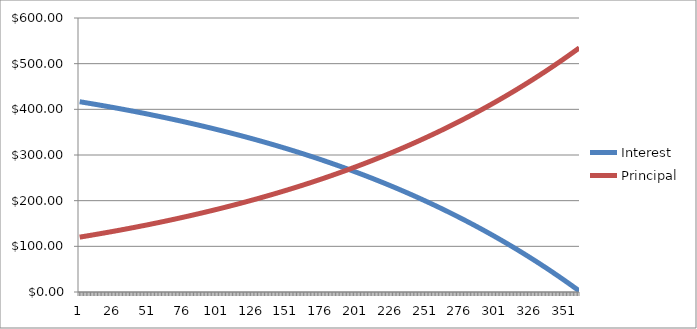
| Category | Interest | Principal |
|---|---|---|
| 0 | 416.667 | 120.155 |
| 1 | 416.166 | 120.656 |
| 2 | 415.663 | 121.158 |
| 3 | 415.158 | 121.663 |
| 4 | 414.652 | 122.17 |
| 5 | 414.142 | 122.679 |
| 6 | 413.631 | 123.19 |
| 7 | 413.118 | 123.704 |
| 8 | 412.603 | 124.219 |
| 9 | 412.085 | 124.737 |
| 10 | 411.565 | 125.256 |
| 11 | 411.043 | 125.778 |
| 12 | 410.519 | 126.302 |
| 13 | 409.993 | 126.829 |
| 14 | 409.465 | 127.357 |
| 15 | 408.934 | 127.888 |
| 16 | 408.401 | 128.421 |
| 17 | 407.866 | 128.956 |
| 18 | 407.329 | 129.493 |
| 19 | 406.789 | 130.032 |
| 20 | 406.247 | 130.574 |
| 21 | 405.703 | 131.118 |
| 22 | 405.157 | 131.665 |
| 23 | 404.608 | 132.213 |
| 24 | 404.057 | 132.764 |
| 25 | 403.504 | 133.317 |
| 26 | 402.949 | 133.873 |
| 27 | 402.391 | 134.431 |
| 28 | 401.831 | 134.991 |
| 29 | 401.268 | 135.553 |
| 30 | 400.704 | 136.118 |
| 31 | 400.136 | 136.685 |
| 32 | 399.567 | 137.255 |
| 33 | 398.995 | 137.827 |
| 34 | 398.421 | 138.401 |
| 35 | 397.844 | 138.978 |
| 36 | 397.265 | 139.557 |
| 37 | 396.683 | 140.138 |
| 38 | 396.1 | 140.722 |
| 39 | 395.513 | 141.308 |
| 40 | 394.924 | 141.897 |
| 41 | 394.333 | 142.488 |
| 42 | 393.74 | 143.082 |
| 43 | 393.143 | 143.678 |
| 44 | 392.545 | 144.277 |
| 45 | 391.944 | 144.878 |
| 46 | 391.34 | 145.482 |
| 47 | 390.734 | 146.088 |
| 48 | 390.125 | 146.697 |
| 49 | 389.514 | 147.308 |
| 50 | 388.9 | 147.922 |
| 51 | 388.284 | 148.538 |
| 52 | 387.665 | 149.157 |
| 53 | 387.043 | 149.778 |
| 54 | 386.419 | 150.402 |
| 55 | 385.792 | 151.029 |
| 56 | 385.163 | 151.658 |
| 57 | 384.531 | 152.29 |
| 58 | 383.897 | 152.925 |
| 59 | 383.26 | 153.562 |
| 60 | 382.62 | 154.202 |
| 61 | 381.977 | 154.844 |
| 62 | 381.332 | 155.49 |
| 63 | 380.684 | 156.137 |
| 64 | 380.034 | 156.788 |
| 65 | 379.38 | 157.441 |
| 66 | 378.724 | 158.097 |
| 67 | 378.066 | 158.756 |
| 68 | 377.404 | 159.418 |
| 69 | 376.74 | 160.082 |
| 70 | 376.073 | 160.749 |
| 71 | 375.403 | 161.419 |
| 72 | 374.73 | 162.091 |
| 73 | 374.055 | 162.767 |
| 74 | 373.377 | 163.445 |
| 75 | 372.696 | 164.126 |
| 76 | 372.012 | 164.81 |
| 77 | 371.325 | 165.496 |
| 78 | 370.636 | 166.186 |
| 79 | 369.943 | 166.878 |
| 80 | 369.248 | 167.574 |
| 81 | 368.55 | 168.272 |
| 82 | 367.849 | 168.973 |
| 83 | 367.145 | 169.677 |
| 84 | 366.438 | 170.384 |
| 85 | 365.728 | 171.094 |
| 86 | 365.015 | 171.807 |
| 87 | 364.299 | 172.523 |
| 88 | 363.58 | 173.242 |
| 89 | 362.858 | 173.963 |
| 90 | 362.133 | 174.688 |
| 91 | 361.405 | 175.416 |
| 92 | 360.675 | 176.147 |
| 93 | 359.941 | 176.881 |
| 94 | 359.204 | 177.618 |
| 95 | 358.464 | 178.358 |
| 96 | 357.72 | 179.101 |
| 97 | 356.974 | 179.847 |
| 98 | 356.225 | 180.597 |
| 99 | 355.472 | 181.349 |
| 100 | 354.717 | 182.105 |
| 101 | 353.958 | 182.864 |
| 102 | 353.196 | 183.626 |
| 103 | 352.431 | 184.391 |
| 104 | 351.663 | 185.159 |
| 105 | 350.891 | 185.931 |
| 106 | 350.116 | 186.705 |
| 107 | 349.338 | 187.483 |
| 108 | 348.557 | 188.264 |
| 109 | 347.773 | 189.049 |
| 110 | 346.985 | 189.837 |
| 111 | 346.194 | 190.628 |
| 112 | 345.4 | 191.422 |
| 113 | 344.602 | 192.219 |
| 114 | 343.801 | 193.02 |
| 115 | 342.997 | 193.825 |
| 116 | 342.189 | 194.632 |
| 117 | 341.379 | 195.443 |
| 118 | 340.564 | 196.257 |
| 119 | 339.746 | 197.075 |
| 120 | 338.925 | 197.896 |
| 121 | 338.101 | 198.721 |
| 122 | 337.273 | 199.549 |
| 123 | 336.441 | 200.38 |
| 124 | 335.606 | 201.215 |
| 125 | 334.768 | 202.054 |
| 126 | 333.926 | 202.896 |
| 127 | 333.081 | 203.741 |
| 128 | 332.232 | 204.59 |
| 129 | 331.379 | 205.442 |
| 130 | 330.523 | 206.298 |
| 131 | 329.664 | 207.158 |
| 132 | 328.801 | 208.021 |
| 133 | 327.934 | 208.888 |
| 134 | 327.063 | 209.758 |
| 135 | 326.189 | 210.632 |
| 136 | 325.312 | 211.51 |
| 137 | 324.43 | 212.391 |
| 138 | 323.546 | 213.276 |
| 139 | 322.657 | 214.165 |
| 140 | 321.765 | 215.057 |
| 141 | 320.868 | 215.953 |
| 142 | 319.969 | 216.853 |
| 143 | 319.065 | 217.757 |
| 144 | 318.158 | 218.664 |
| 145 | 317.247 | 219.575 |
| 146 | 316.332 | 220.49 |
| 147 | 315.413 | 221.409 |
| 148 | 314.491 | 222.331 |
| 149 | 313.564 | 223.257 |
| 150 | 312.634 | 224.188 |
| 151 | 311.7 | 225.122 |
| 152 | 310.762 | 226.06 |
| 153 | 309.82 | 227.002 |
| 154 | 308.874 | 227.948 |
| 155 | 307.924 | 228.897 |
| 156 | 306.971 | 229.851 |
| 157 | 306.013 | 230.809 |
| 158 | 305.051 | 231.771 |
| 159 | 304.085 | 232.736 |
| 160 | 303.116 | 233.706 |
| 161 | 302.142 | 234.68 |
| 162 | 301.164 | 235.658 |
| 163 | 300.182 | 236.639 |
| 164 | 299.196 | 237.625 |
| 165 | 298.206 | 238.616 |
| 166 | 297.212 | 239.61 |
| 167 | 296.213 | 240.608 |
| 168 | 295.211 | 241.611 |
| 169 | 294.204 | 242.617 |
| 170 | 293.193 | 243.628 |
| 171 | 292.178 | 244.643 |
| 172 | 291.159 | 245.663 |
| 173 | 290.135 | 246.686 |
| 174 | 289.107 | 247.714 |
| 175 | 288.075 | 248.746 |
| 176 | 287.039 | 249.783 |
| 177 | 285.998 | 250.824 |
| 178 | 284.953 | 251.869 |
| 179 | 283.903 | 252.918 |
| 180 | 282.85 | 253.972 |
| 181 | 281.791 | 255.03 |
| 182 | 280.729 | 256.093 |
| 183 | 279.662 | 257.16 |
| 184 | 278.59 | 258.231 |
| 185 | 277.514 | 259.307 |
| 186 | 276.434 | 260.388 |
| 187 | 275.349 | 261.473 |
| 188 | 274.259 | 262.562 |
| 189 | 273.165 | 263.656 |
| 190 | 272.067 | 264.755 |
| 191 | 270.964 | 265.858 |
| 192 | 269.856 | 266.966 |
| 193 | 268.744 | 268.078 |
| 194 | 267.627 | 269.195 |
| 195 | 266.505 | 270.317 |
| 196 | 265.379 | 271.443 |
| 197 | 264.248 | 272.574 |
| 198 | 263.112 | 273.71 |
| 199 | 261.971 | 274.85 |
| 200 | 260.826 | 275.995 |
| 201 | 259.676 | 277.145 |
| 202 | 258.521 | 278.3 |
| 203 | 257.362 | 279.46 |
| 204 | 256.197 | 280.624 |
| 205 | 255.028 | 281.793 |
| 206 | 253.854 | 282.968 |
| 207 | 252.675 | 284.147 |
| 208 | 251.491 | 285.331 |
| 209 | 250.302 | 286.519 |
| 210 | 249.108 | 287.713 |
| 211 | 247.91 | 288.912 |
| 212 | 246.706 | 290.116 |
| 213 | 245.497 | 291.325 |
| 214 | 244.283 | 292.539 |
| 215 | 243.064 | 293.757 |
| 216 | 241.84 | 294.981 |
| 217 | 240.611 | 296.211 |
| 218 | 239.377 | 297.445 |
| 219 | 238.138 | 298.684 |
| 220 | 236.893 | 299.929 |
| 221 | 235.643 | 301.178 |
| 222 | 234.388 | 302.433 |
| 223 | 233.128 | 303.693 |
| 224 | 231.863 | 304.959 |
| 225 | 230.592 | 306.229 |
| 226 | 229.316 | 307.505 |
| 227 | 228.035 | 308.787 |
| 228 | 226.748 | 310.073 |
| 229 | 225.456 | 311.365 |
| 230 | 224.159 | 312.663 |
| 231 | 222.856 | 313.965 |
| 232 | 221.548 | 315.274 |
| 233 | 220.234 | 316.587 |
| 234 | 218.915 | 317.906 |
| 235 | 217.591 | 319.231 |
| 236 | 216.261 | 320.561 |
| 237 | 214.925 | 321.897 |
| 238 | 213.584 | 323.238 |
| 239 | 212.237 | 324.585 |
| 240 | 210.884 | 325.937 |
| 241 | 209.526 | 327.295 |
| 242 | 208.163 | 328.659 |
| 243 | 206.793 | 330.028 |
| 244 | 205.418 | 331.404 |
| 245 | 204.037 | 332.784 |
| 246 | 202.651 | 334.171 |
| 247 | 201.258 | 335.563 |
| 248 | 199.86 | 336.962 |
| 249 | 198.456 | 338.366 |
| 250 | 197.046 | 339.775 |
| 251 | 195.631 | 341.191 |
| 252 | 194.209 | 342.613 |
| 253 | 192.781 | 344.04 |
| 254 | 191.348 | 345.474 |
| 255 | 189.908 | 346.913 |
| 256 | 188.463 | 348.359 |
| 257 | 187.011 | 349.81 |
| 258 | 185.554 | 351.268 |
| 259 | 184.09 | 352.731 |
| 260 | 182.621 | 354.201 |
| 261 | 181.145 | 355.677 |
| 262 | 179.663 | 357.159 |
| 263 | 178.175 | 358.647 |
| 264 | 176.68 | 360.141 |
| 265 | 175.18 | 361.642 |
| 266 | 173.673 | 363.149 |
| 267 | 172.16 | 364.662 |
| 268 | 170.64 | 366.181 |
| 269 | 169.114 | 367.707 |
| 270 | 167.582 | 369.239 |
| 271 | 166.044 | 370.778 |
| 272 | 164.499 | 372.323 |
| 273 | 162.948 | 373.874 |
| 274 | 161.39 | 375.432 |
| 275 | 159.825 | 376.996 |
| 276 | 158.255 | 378.567 |
| 277 | 156.677 | 380.144 |
| 278 | 155.093 | 381.728 |
| 279 | 153.503 | 383.319 |
| 280 | 151.906 | 384.916 |
| 281 | 150.302 | 386.52 |
| 282 | 148.691 | 388.13 |
| 283 | 147.074 | 389.747 |
| 284 | 145.45 | 391.371 |
| 285 | 143.819 | 393.002 |
| 286 | 142.182 | 394.64 |
| 287 | 140.538 | 396.284 |
| 288 | 138.886 | 397.935 |
| 289 | 137.228 | 399.593 |
| 290 | 135.563 | 401.258 |
| 291 | 133.891 | 402.93 |
| 292 | 132.213 | 404.609 |
| 293 | 130.527 | 406.295 |
| 294 | 128.834 | 407.988 |
| 295 | 127.134 | 409.688 |
| 296 | 125.427 | 411.395 |
| 297 | 123.713 | 413.109 |
| 298 | 121.991 | 414.83 |
| 299 | 120.263 | 416.559 |
| 300 | 118.527 | 418.294 |
| 301 | 116.784 | 420.037 |
| 302 | 115.034 | 421.787 |
| 303 | 113.277 | 423.545 |
| 304 | 111.512 | 425.31 |
| 305 | 109.74 | 427.082 |
| 306 | 107.96 | 428.861 |
| 307 | 106.174 | 430.648 |
| 308 | 104.379 | 432.442 |
| 309 | 102.577 | 434.244 |
| 310 | 100.768 | 436.054 |
| 311 | 98.951 | 437.871 |
| 312 | 97.127 | 439.695 |
| 313 | 95.295 | 441.527 |
| 314 | 93.455 | 443.367 |
| 315 | 91.607 | 445.214 |
| 316 | 89.752 | 447.069 |
| 317 | 87.89 | 448.932 |
| 318 | 86.019 | 450.803 |
| 319 | 84.141 | 452.681 |
| 320 | 82.255 | 454.567 |
| 321 | 80.361 | 456.461 |
| 322 | 78.459 | 458.363 |
| 323 | 76.549 | 460.273 |
| 324 | 74.631 | 462.191 |
| 325 | 72.705 | 464.116 |
| 326 | 70.771 | 466.05 |
| 327 | 68.829 | 467.992 |
| 328 | 66.88 | 469.942 |
| 329 | 64.921 | 471.9 |
| 330 | 62.955 | 473.866 |
| 331 | 60.981 | 475.841 |
| 332 | 58.998 | 477.824 |
| 333 | 57.007 | 479.815 |
| 334 | 55.008 | 481.814 |
| 335 | 53 | 483.821 |
| 336 | 50.984 | 485.837 |
| 337 | 48.96 | 487.862 |
| 338 | 46.927 | 489.894 |
| 339 | 44.886 | 491.936 |
| 340 | 42.836 | 493.985 |
| 341 | 40.778 | 496.044 |
| 342 | 38.711 | 498.11 |
| 343 | 36.636 | 500.186 |
| 344 | 34.552 | 502.27 |
| 345 | 32.459 | 504.363 |
| 346 | 30.357 | 506.464 |
| 347 | 28.247 | 508.575 |
| 348 | 26.128 | 510.694 |
| 349 | 24 | 512.821 |
| 350 | 21.863 | 514.958 |
| 351 | 19.718 | 517.104 |
| 352 | 17.563 | 519.258 |
| 353 | 15.4 | 521.422 |
| 354 | 13.227 | 523.595 |
| 355 | 11.045 | 525.776 |
| 356 | 8.855 | 527.967 |
| 357 | 6.655 | 530.167 |
| 358 | 4.446 | 532.376 |
| 359 | 2.227 | 534.594 |